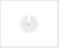
| Category | Series 0 |
|---|---|
| 0 | 10.487 |